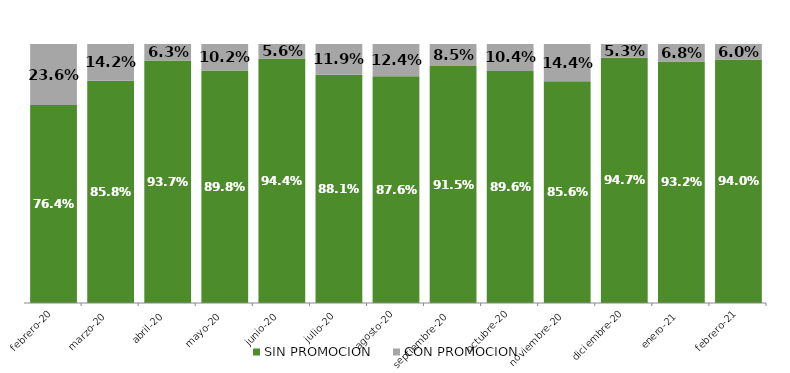
| Category | SIN PROMOCION   | CON PROMOCION   |
|---|---|---|
| 2020-02-01 | 0.764 | 0.236 |
| 2020-03-01 | 0.858 | 0.142 |
| 2020-04-01 | 0.937 | 0.063 |
| 2020-05-01 | 0.898 | 0.102 |
| 2020-06-01 | 0.944 | 0.056 |
| 2020-07-01 | 0.881 | 0.119 |
| 2020-08-01 | 0.876 | 0.124 |
| 2020-09-01 | 0.915 | 0.085 |
| 2020-10-01 | 0.896 | 0.104 |
| 2020-11-01 | 0.856 | 0.144 |
| 2020-12-01 | 0.947 | 0.053 |
| 2021-01-01 | 0.932 | 0.068 |
| 2021-02-01 | 0.94 | 0.06 |